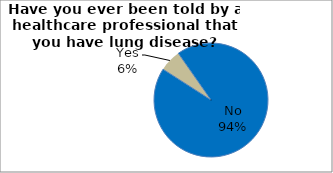
| Category | Series 0 |
|---|---|
| No | 93.81 |
| Yes | 6.19 |